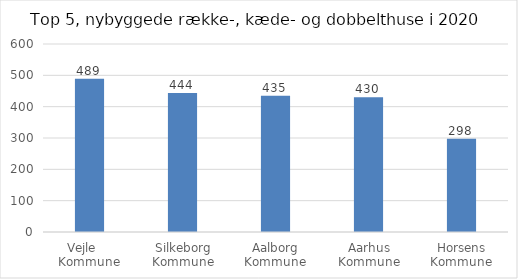
| Category | Series 0 |
|---|---|
| Vejle     Kommune | 489 |
| Silkeborg Kommune | 444 |
| Aalborg Kommune | 435 |
| Aarhus Kommune | 430 |
| Horsens Kommune | 298 |